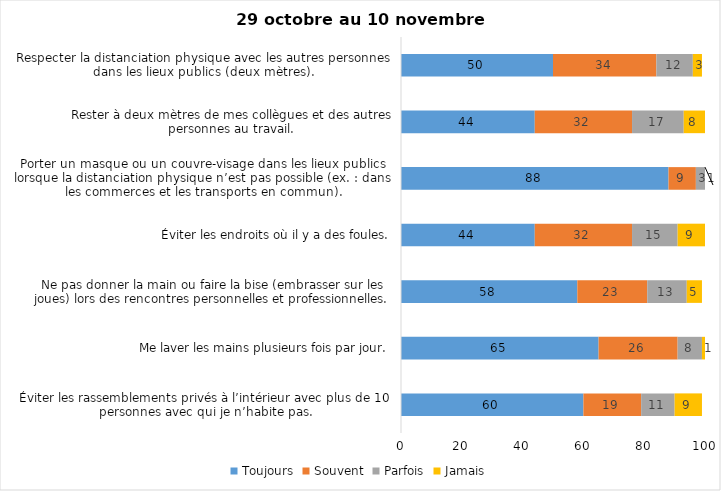
| Category | Toujours | Souvent | Parfois | Jamais |
|---|---|---|---|---|
| Éviter les rassemblements privés à l’intérieur avec plus de 10 personnes avec qui je n’habite pas. | 60 | 19 | 11 | 9 |
| Me laver les mains plusieurs fois par jour. | 65 | 26 | 8 | 1 |
| Ne pas donner la main ou faire la bise (embrasser sur les joues) lors des rencontres personnelles et professionnelles. | 58 | 23 | 13 | 5 |
| Éviter les endroits où il y a des foules. | 44 | 32 | 15 | 9 |
| Porter un masque ou un couvre-visage dans les lieux publics lorsque la distanciation physique n’est pas possible (ex. : dans les commerces et les transports en commun). | 88 | 9 | 3 | 1 |
| Rester à deux mètres de mes collègues et des autres personnes au travail. | 44 | 32 | 17 | 8 |
| Respecter la distanciation physique avec les autres personnes dans les lieux publics (deux mètres). | 50 | 34 | 12 | 3 |